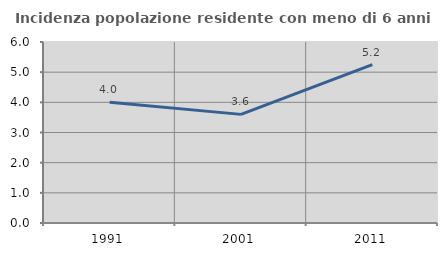
| Category | Incidenza popolazione residente con meno di 6 anni |
|---|---|
| 1991.0 | 4.002 |
| 2001.0 | 3.601 |
| 2011.0 | 5.247 |